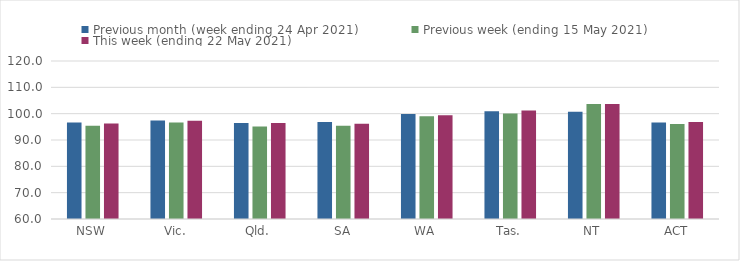
| Category | Previous month (week ending 24 Apr 2021) | Previous week (ending 15 May 2021) | This week (ending 22 May 2021) |
|---|---|---|---|
| NSW | 96.62 | 95.39 | 96.31 |
| Vic. | 97.41 | 96.61 | 97.28 |
| Qld. | 96.42 | 95.1 | 96.43 |
| SA | 96.86 | 95.38 | 96.17 |
| WA | 99.83 | 98.99 | 99.42 |
| Tas. | 100.88 | 100.07 | 101.22 |
| NT | 100.73 | 103.7 | 103.7 |
| ACT | 96.62 | 96.03 | 96.86 |